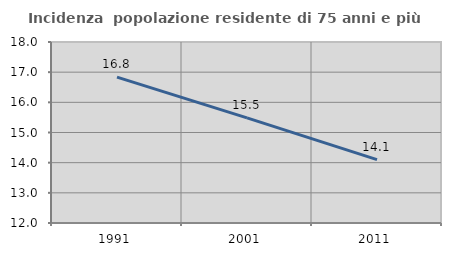
| Category | Incidenza  popolazione residente di 75 anni e più |
|---|---|
| 1991.0 | 16.838 |
| 2001.0 | 15.485 |
| 2011.0 | 14.1 |